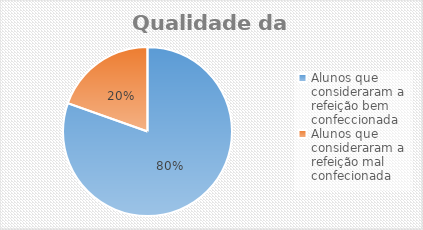
| Category | Series 5 |
|---|---|
| Alunos que consideraram a refeição bem confeccionada  | 74 |
| Alunos que consideraram a refeição mal confecionada  | 18 |